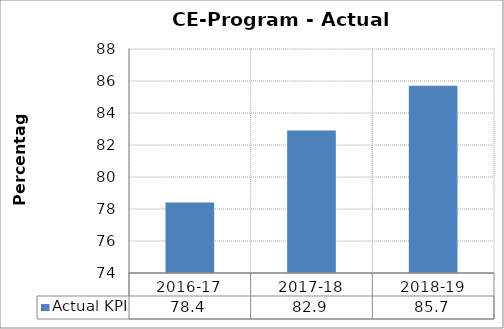
| Category | Actual KPI |
|---|---|
| 2016-17 | 78.4 |
| 2017-18 | 82.9 |
| 2018-19 | 85.7 |